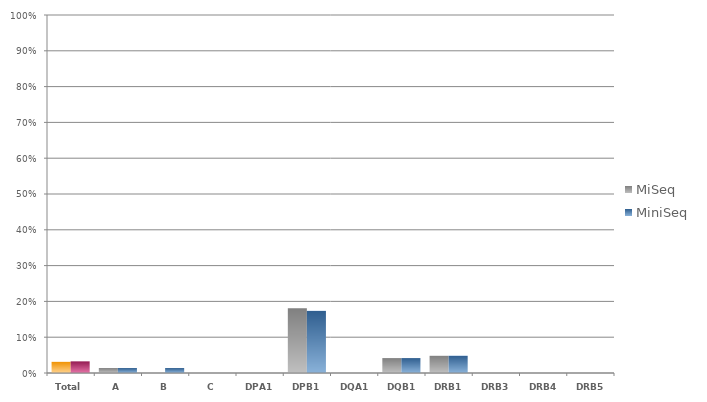
| Category | MiSeq | MiniSeq |
|---|---|---|
| Total | 0.032 | 0.033 |
| A | 0.014 | 0.014 |
| B | 0 | 0.014 |
| C | 0 | 0 |
| DPA1 | 0 | 0 |
| DPB1 | 0.181 | 0.174 |
| DQA1 | 0 | 0 |
| DQB1 | 0.042 | 0.042 |
| DRB1 | 0.049 | 0.049 |
| DRB3 | 0 | 0 |
| DRB4 | 0 | 0 |
| DRB5 | 0 | 0 |